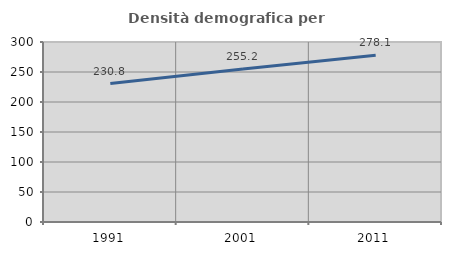
| Category | Densità demografica |
|---|---|
| 1991.0 | 230.823 |
| 2001.0 | 255.188 |
| 2011.0 | 278.057 |